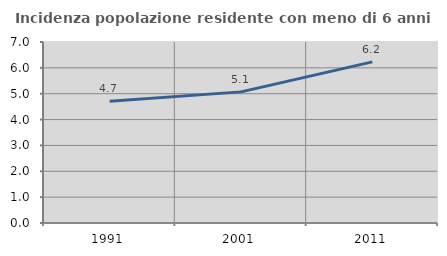
| Category | Incidenza popolazione residente con meno di 6 anni |
|---|---|
| 1991.0 | 4.705 |
| 2001.0 | 5.071 |
| 2011.0 | 6.232 |